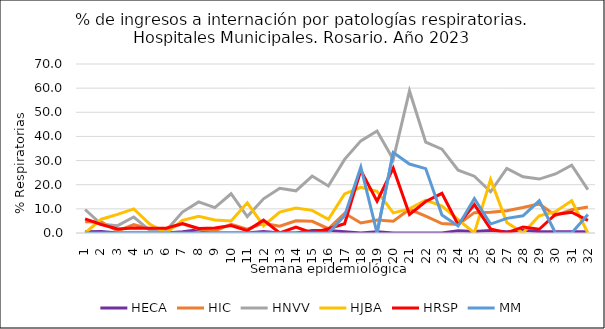
| Category | HECA | HIC | HNVV | HJBA | HRSP | MM |
|---|---|---|---|---|---|---|
| 1.0 | 0.556 | 4.673 | 9.735 | 0 | 5.882 | 0 |
| 2.0 | 0.645 | 4.58 | 3.604 | 5.714 | 3.509 | 0 |
| 3.0 | 0 | 0.877 | 3.03 | 7.692 | 1.639 | 0 |
| 4.0 | 0 | 3.509 | 6.612 | 10 | 2.02 | 0 |
| 5.0 | 0 | 1.667 | 1 | 3.571 | 1.961 | 0 |
| 6.0 | 0 | 1.667 | 1 | 0 | 1.961 | 0 |
| 7.0 | 0.538 | 3.759 | 8.661 | 5.263 | 3.922 | 0 |
| 8.0 | 1.307 | 1.695 | 12.871 | 6.897 | 1.887 | 0 |
| 9.0 | 0 | 0.84 | 10.526 | 5.405 | 2.055 | 0 |
| 10.0 | 0 | 3.636 | 16.26 | 5 | 3.125 | 0 |
| 11.0 | 0 | 1.55 | 6.818 | 12.5 | 1 | 0 |
| 12.0 | 0.654 | 4.065 | 14.167 | 3.03 | 5.319 | 0 |
| 13.0 | 0 | 2.797 | 18.519 | 8.696 | 0 | 0 |
| 14.0 | 0 | 5.072 | 17.46 | 10.345 | 2.439 | 0 |
| 15.0 | 1.087 | 4.839 | 23.571 | 9.375 | 0 | 0 |
| 16.0 | 1.064 | 1.77 | 19.444 | 5.714 | 1.754 | 0 |
| 17.0 | 0.535 | 8.148 | 30.496 | 16.216 | 3.846 | 7.143 |
| 18.0 | 0 | 4.167 | 38.168 | 18.919 | 25.926 | 27.273 |
| 19.0 | 0.5 | 5.376 | 42.262 | 17.241 | 13.187 | 0 |
| 20.0 | 0 | 4.854 | 30.469 | 8.333 | 26.866 | 33.333 |
| 21.0 | 0 | 9.821 | 58.824 | 10 | 7.692 | 28.571 |
| 22.0 | 0 | 7 | 37.615 | 13.636 | 13.043 | 26.667 |
| 23.0 | 0 | 3.922 | 34.746 | 11.111 | 16.438 | 7.407 |
| 24.0 | 0.971 | 3.571 | 26.042 | 5.556 | 3.409 | 2.941 |
| 25.0 | 0.637 | 8.434 | 23.529 | 0 | 11.765 | 14.286 |
| 26.0 | 1.064 | 8.602 | 17.073 | 22.222 | 1.724 | 3.704 |
| 27.0 | 0.5 | 9.184 | 26.724 | 4.348 | 0 | 6.061 |
| 28.0 | 1.105 | 10.526 | 23.301 | 0 | 2.5 | 7.143 |
| 29.0 | 0.578 | 12.048 | 22.33 | 7.143 | 1.538 | 13.333 |
| 30.0 | 0.549 | 7.273 | 24.444 | 8.824 | 7.692 | 0 |
| 31.0 | 0.495 | 9.615 | 28.049 | 13.333 | 8.602 | 0 |
| 32.0 | 0.541 | 10.753 | 17.949 | 0 | 5.263 | 7.692 |